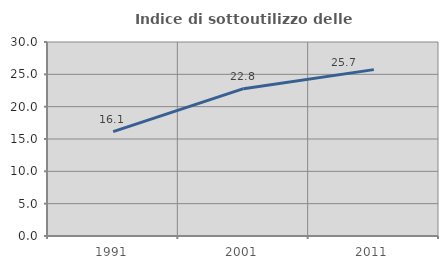
| Category | Indice di sottoutilizzo delle abitazioni  |
|---|---|
| 1991.0 | 16.137 |
| 2001.0 | 22.786 |
| 2011.0 | 25.726 |